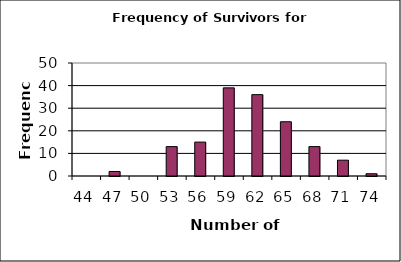
| Category | Series 1 |
|---|---|
| 44.0 | 0 |
| 47.0 | 2 |
| 50.0 | 0 |
| 53.0 | 13 |
| 56.0 | 15 |
| 59.0 | 39 |
| 62.0 | 36 |
| 65.0 | 24 |
| 68.0 | 13 |
| 71.0 | 7 |
| 74.0 | 1 |